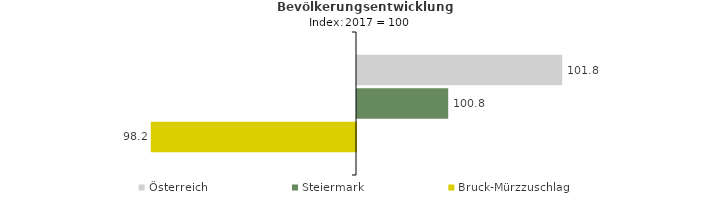
| Category | Österreich | Steiermark | Bruck-Mürzzuschlag |
|---|---|---|---|
| 2021.0 | 101.8 | 100.8 | 98.2 |